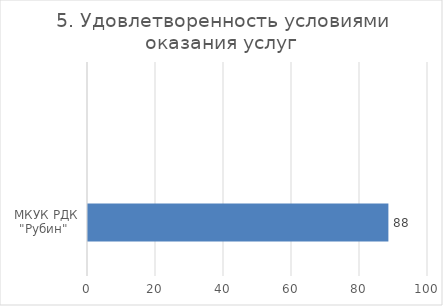
| Category | 5. Удовлетворенность условиями оказания услуг |
|---|---|
| МКУК РДК "Рубин"  | 88.351 |